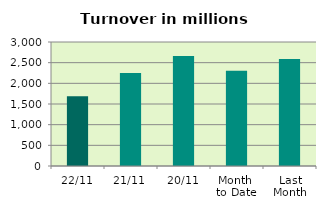
| Category | Series 0 |
|---|---|
| 22/11 | 1684.774 |
| 21/11 | 2250.099 |
| 20/11 | 2659.828 |
| Month 
to Date | 2305.286 |
| Last
Month | 2586.958 |